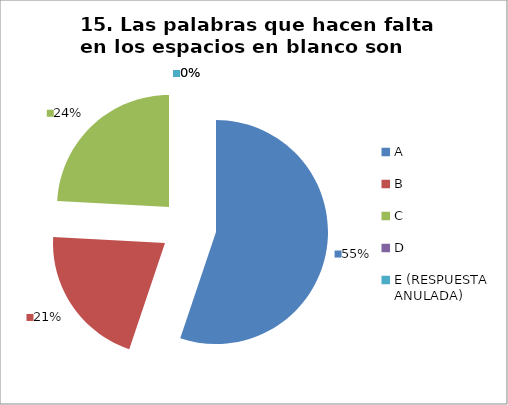
| Category | CANTIDAD DE RESPUESTAS PREGUNTA (15) | PORCENTAJE |
|---|---|---|
| A | 16 | 0.552 |
| B | 6 | 0.207 |
| C | 7 | 0.241 |
| D | 0 | 0 |
| E (RESPUESTA ANULADA) | 0 | 0 |